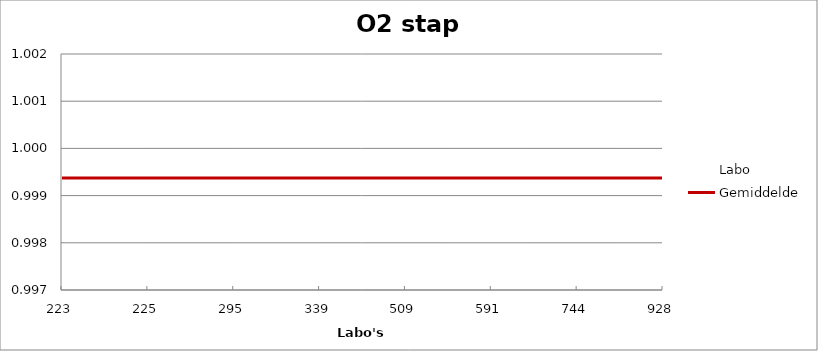
| Category | Labo | Gemiddelde |
|---|---|---|
| 223.0 | 0.999 | 0.999 |
| 225.0 | 1 | 0.999 |
| 295.0 | 0.999 | 0.999 |
| 339.0 | 1 | 0.999 |
| 509.0 | 0.998 | 0.999 |
| 591.0 | 1.001 | 0.999 |
| 744.0 | 0.998 | 0.999 |
| 928.0 | 0.999 | 0.999 |